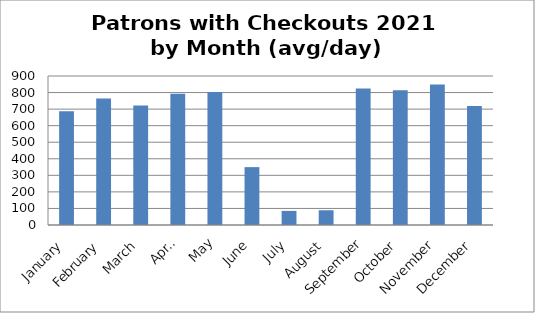
| Category | 687 |
|---|---|
| January | 686.516 |
| February | 764.143 |
| March | 721.548 |
| April | 793.5 |
| May | 803.871 |
| June | 349.533 |
| July | 85.258 |
| August | 89 |
| September | 824.667 |
| October | 813.29 |
| November | 848.367 |
| December | 718.194 |